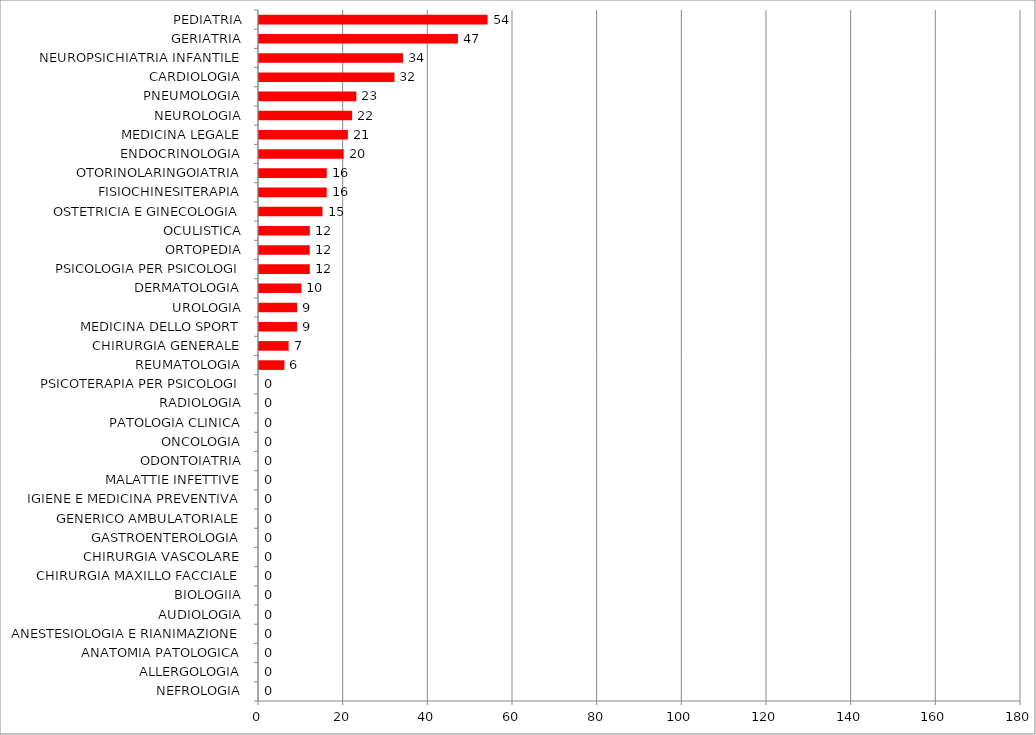
| Category | Series 0 |
|---|---|
| NEFROLOGIA | 0 |
| ALLERGOLOGIA | 0 |
| ANATOMIA PATOLOGICA | 0 |
| ANESTESIOLOGIA E RIANIMAZIONE | 0 |
| AUDIOLOGIA | 0 |
| BIOLOGIIA | 0 |
| CHIRURGIA MAXILLO FACCIALE | 0 |
| CHIRURGIA VASCOLARE | 0 |
| GASTROENTEROLOGIA | 0 |
| GENERICO AMBULATORIALE | 0 |
| IGIENE E MEDICINA PREVENTIVA | 0 |
| MALATTIE INFETTIVE | 0 |
| ODONTOIATRIA | 0 |
| ONCOLOGIA | 0 |
| PATOLOGIA CLINICA | 0 |
| RADIOLOGIA | 0 |
| PSICOTERAPIA PER PSICOLOGI | 0 |
| REUMATOLOGIA | 6 |
| CHIRURGIA GENERALE | 7 |
| MEDICINA DELLO SPORT | 9 |
| UROLOGIA | 9 |
| DERMATOLOGIA | 10 |
| PSICOLOGIA PER PSICOLOGI | 12 |
| ORTOPEDIA | 12 |
| OCULISTICA | 12 |
| OSTETRICIA E GINECOLOGIA | 15 |
| FISIOCHINESITERAPIA | 16 |
| OTORINOLARINGOIATRIA | 16 |
| ENDOCRINOLOGIA | 20 |
| MEDICINA LEGALE | 21 |
| NEUROLOGIA | 22 |
| PNEUMOLOGIA | 23 |
| CARDIOLOGIA | 32 |
| NEUROPSICHIATRIA INFANTILE | 34 |
| GERIATRIA | 47 |
| PEDIATRIA | 54 |